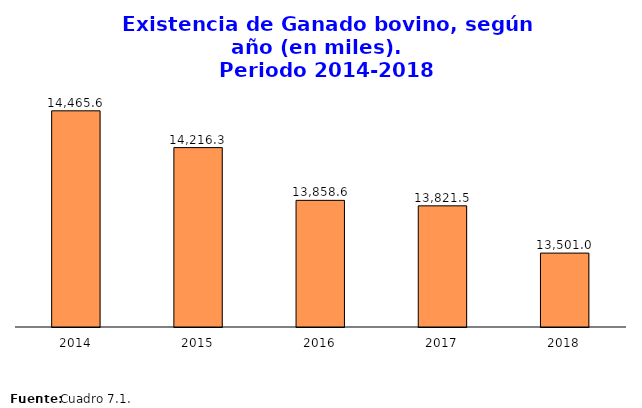
| Category | Total |
|---|---|
| 2014.0 | 14465.581 |
| 2015.0 | 14216.3 |
| 2016.0 | 13858.6 |
| 2017.0 | 13821.5 |
| 2018.0 | 13500.965 |